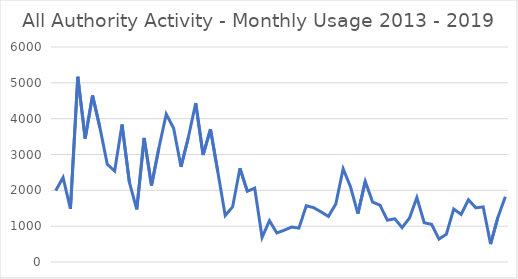
| Category | All Authority |
|---|---|
| 0 | 1991 |
| 1 | 2358 |
| 2 | 1483 |
| 3 | 5169 |
| 4 | 3447 |
| 5 | 4648 |
| 6 | 3749 |
| 7 | 2726 |
| 8 | 2538 |
| 9 | 3836 |
| 10 | 2222 |
| 11 | 1470 |
| 12 | 3462 |
| 13 | 2135 |
| 14 | 3182 |
| 15 | 4127 |
| 16 | 3731 |
| 17 | 2657 |
| 18 | 3481 |
| 19 | 4433 |
| 20 | 2987 |
| 21 | 3707 |
| 22 | 2510 |
| 23 | 1295 |
| 24 | 1537 |
| 25 | 2614 |
| 26 | 1973 |
| 27 | 2062 |
| 28 | 687 |
| 29 | 1152 |
| 30 | 809 |
| 31 | 887 |
| 32 | 975 |
| 33 | 946 |
| 34 | 1570 |
| 35 | 1516 |
| 36 | 1399 |
| 37 | 1272 |
| 38 | 1616 |
| 39 | 2601 |
| 40 | 2097 |
| 41 | 1348 |
| 42 | 2250 |
| 43 | 1672 |
| 44 | 1585 |
| 45 | 1166 |
| 46 | 1207 |
| 47 | 960 |
| 48 | 1227 |
| 49 | 1799 |
| 50 | 1096 |
| 51 | 1050 |
| 52 | 640 |
| 53 | 774 |
| 54 | 1479 |
| 55 | 1328 |
| 56 | 1737 |
| 57 | 1512 |
| 58 | 1538 |
| 59 | 501 |
| 60 | 1250 |
| 61 | 1820 |